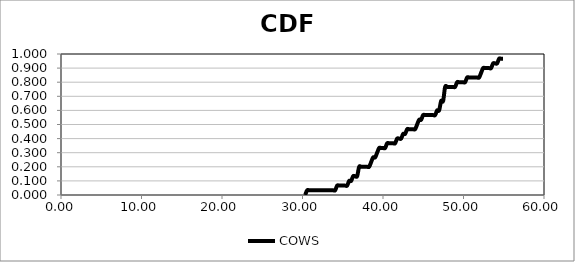
| Category | COWS |
|---|---|
| 30.33 | 0 |
| 30.578383838383836 | 0.033 |
| 30.826767676767673 | 0.033 |
| 31.07515151515151 | 0.033 |
| 31.32353535353535 | 0.033 |
| 31.571919191919186 | 0.033 |
| 31.820303030303023 | 0.033 |
| 32.06868686868686 | 0.033 |
| 32.3170707070707 | 0.033 |
| 32.565454545454536 | 0.033 |
| 32.81383838383837 | 0.033 |
| 33.06222222222221 | 0.033 |
| 33.31060606060605 | 0.033 |
| 33.558989898989886 | 0.033 |
| 33.80737373737372 | 0.033 |
| 34.05575757575756 | 0.033 |
| 34.3041414141414 | 0.067 |
| 34.552525252525236 | 0.067 |
| 34.80090909090907 | 0.067 |
| 35.04929292929291 | 0.067 |
| 35.29767676767675 | 0.067 |
| 35.546060606060585 | 0.067 |
| 35.79444444444442 | 0.1 |
| 36.04282828282826 | 0.1 |
| 36.2912121212121 | 0.133 |
| 36.539595959595935 | 0.133 |
| 36.78797979797977 | 0.133 |
| 37.03636363636361 | 0.2 |
| 37.28474747474745 | 0.2 |
| 37.533131313131285 | 0.2 |
| 37.78151515151512 | 0.2 |
| 38.02989898989896 | 0.2 |
| 38.2782828282828 | 0.2 |
| 38.526666666666635 | 0.233 |
| 38.77505050505047 | 0.267 |
| 39.02343434343431 | 0.267 |
| 39.27181818181815 | 0.3 |
| 39.520202020201985 | 0.333 |
| 39.76858585858582 | 0.333 |
| 40.01696969696966 | 0.333 |
| 40.2653535353535 | 0.333 |
| 40.513737373737335 | 0.367 |
| 40.76212121212117 | 0.367 |
| 41.01050505050501 | 0.367 |
| 41.25888888888885 | 0.367 |
| 41.507272727272685 | 0.367 |
| 41.75565656565652 | 0.4 |
| 42.00404040404036 | 0.4 |
| 42.2524242424242 | 0.4 |
| 42.500808080808035 | 0.433 |
| 42.74919191919187 | 0.433 |
| 42.99757575757571 | 0.467 |
| 43.24595959595955 | 0.467 |
| 43.494343434343385 | 0.467 |
| 43.74272727272722 | 0.467 |
| 43.99111111111106 | 0.467 |
| 44.2394949494949 | 0.5 |
| 44.487878787878735 | 0.533 |
| 44.73626262626257 | 0.533 |
| 44.98464646464641 | 0.567 |
| 45.23303030303025 | 0.567 |
| 45.481414141414085 | 0.567 |
| 45.72979797979792 | 0.567 |
| 45.97818181818176 | 0.567 |
| 46.2265656565656 | 0.567 |
| 46.474949494949435 | 0.567 |
| 46.72333333333327 | 0.6 |
| 46.97171717171711 | 0.6 |
| 47.22010101010095 | 0.667 |
| 47.468484848484785 | 0.667 |
| 47.71686868686862 | 0.767 |
| 47.96525252525246 | 0.767 |
| 48.2136363636363 | 0.767 |
| 48.462020202020135 | 0.767 |
| 48.71040404040397 | 0.767 |
| 48.95878787878781 | 0.767 |
| 49.20717171717165 | 0.8 |
| 49.455555555555485 | 0.8 |
| 49.70393939393932 | 0.8 |
| 49.95232323232316 | 0.8 |
| 50.200707070707 | 0.8 |
| 50.449090909090835 | 0.833 |
| 50.69747474747467 | 0.833 |
| 50.94585858585851 | 0.833 |
| 51.19424242424235 | 0.833 |
| 51.442626262626185 | 0.833 |
| 51.69101010101002 | 0.833 |
| 51.93939393939386 | 0.833 |
| 52.1877777777777 | 0.867 |
| 52.436161616161534 | 0.9 |
| 52.68454545454537 | 0.9 |
| 52.93292929292921 | 0.9 |
| 53.18131313131305 | 0.9 |
| 53.429696969696884 | 0.9 |
| 53.67808080808072 | 0.933 |
| 53.92646464646456 | 0.933 |
| 54.1748484848484 | 0.933 |
| 54.423232323232234 | 0.967 |
| 54.67161616161607 | 0.967 |
| 54.91999999999991 | 0.967 |